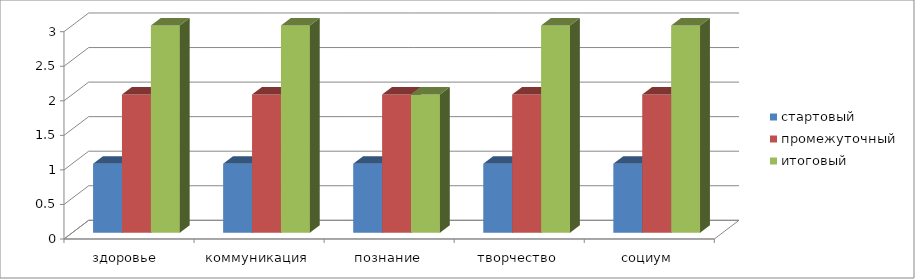
| Category | стартовый | промежуточный | итоговый |
|---|---|---|---|
| здоровье  | 1 | 2 | 3 |
| коммуникация | 1 | 2 | 3 |
| познание | 1 | 2 | 2 |
| творчество | 1 | 2 | 3 |
| социум | 1 | 2 | 3 |